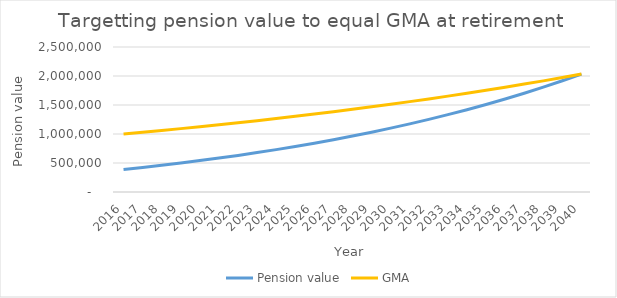
| Category | Pension value | GMA |
|---|---|---|
| 2016.0 | 388587.57 | 1000000 |
| 2017.0 | 423726.086 | 1030000 |
| 2018.0 | 460843.769 | 1060900 |
| 2019.0 | 500037.966 | 1092727 |
| 2020.0 | 541410.518 | 1125508.81 |
| 2021.0 | 585067.959 | 1159274.074 |
| 2022.0 | 631121.725 | 1194052.297 |
| 2023.0 | 679688.374 | 1229873.865 |
| 2024.0 | 730889.814 | 1266770.081 |
| 2025.0 | 784853.541 | 1304773.184 |
| 2026.0 | 841712.888 | 1343916.379 |
| 2027.0 | 901607.283 | 1384233.871 |
| 2028.0 | 964682.522 | 1425760.887 |
| 2029.0 | 1031091.052 | 1468533.713 |
| 2030.0 | 1100992.264 | 1512589.725 |
| 2031.0 | 1174552.805 | 1557967.417 |
| 2032.0 | 1251946.895 | 1604706.439 |
| 2033.0 | 1333356.668 | 1652847.632 |
| 2034.0 | 1418972.519 | 1702433.061 |
| 2035.0 | 1508993.471 | 1753506.053 |
| 2036.0 | 1603627.557 | 1806111.235 |
| 2037.0 | 1703092.22 | 1860294.572 |
| 2038.0 | 1807614.728 | 1916103.409 |
| 2039.0 | 1917432.61 | 1973586.511 |
| 2040.0 | 2032794.106 | 2032794.106 |